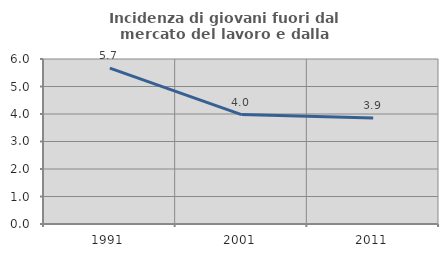
| Category | Incidenza di giovani fuori dal mercato del lavoro e dalla formazione  |
|---|---|
| 1991.0 | 5.669 |
| 2001.0 | 3.979 |
| 2011.0 | 3.859 |